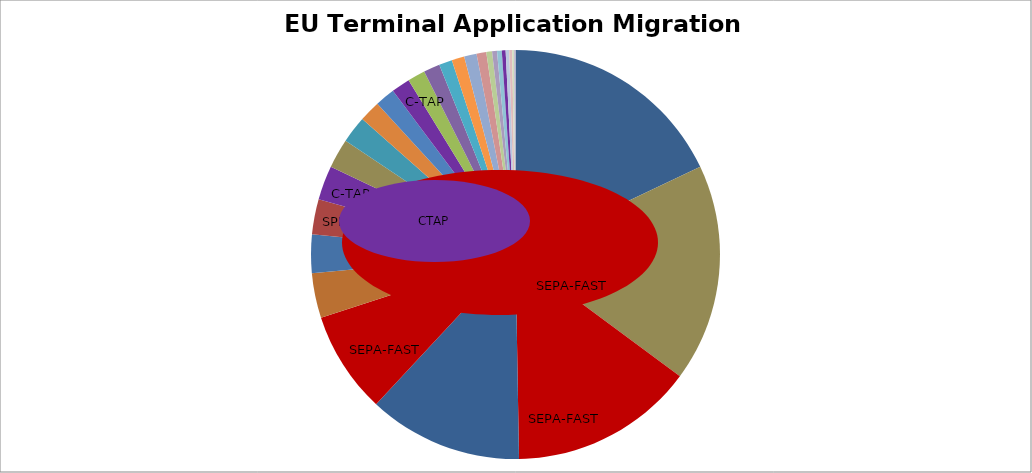
| Category | EU Terminals |
|---|---|
|  | 1653.91 |
| Min Req. | 1584.19 |
| SEPA-FAST | 1344.4 |
| Redsys
CECA | 1125.05 |
| SEPA-FAST | 743.62 |
|  | 326.35 |
|  | 279.16 |
| SPFS | 256.49 |
| C-TAP | 249.19 |
|  | 214.71 |
|  | 196 |
|  | 154.16 |
|  | 144.98 |
| C-TAP | 136.25 |